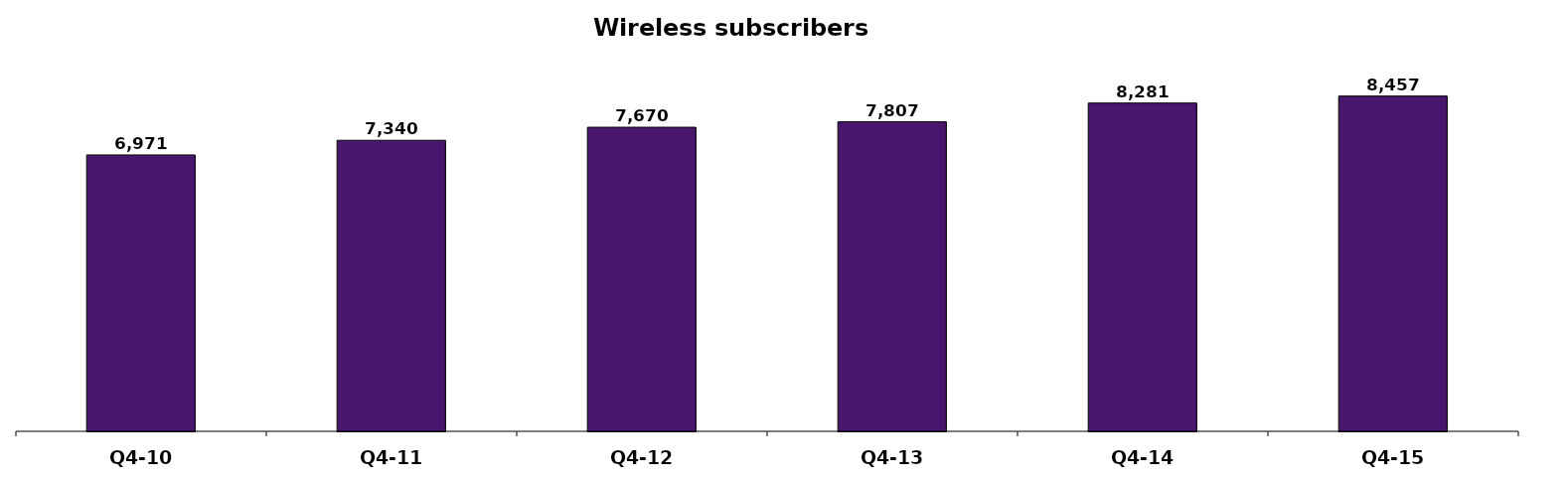
| Category | Series 0 |
|---|---|
| Q4-10 | 6971 |
| Q4-11 | 7340 |
| Q4-12 | 7670 |
| Q4-13 | 7807 |
| Q4-14 | 8281 |
| Q4-15 | 8457 |